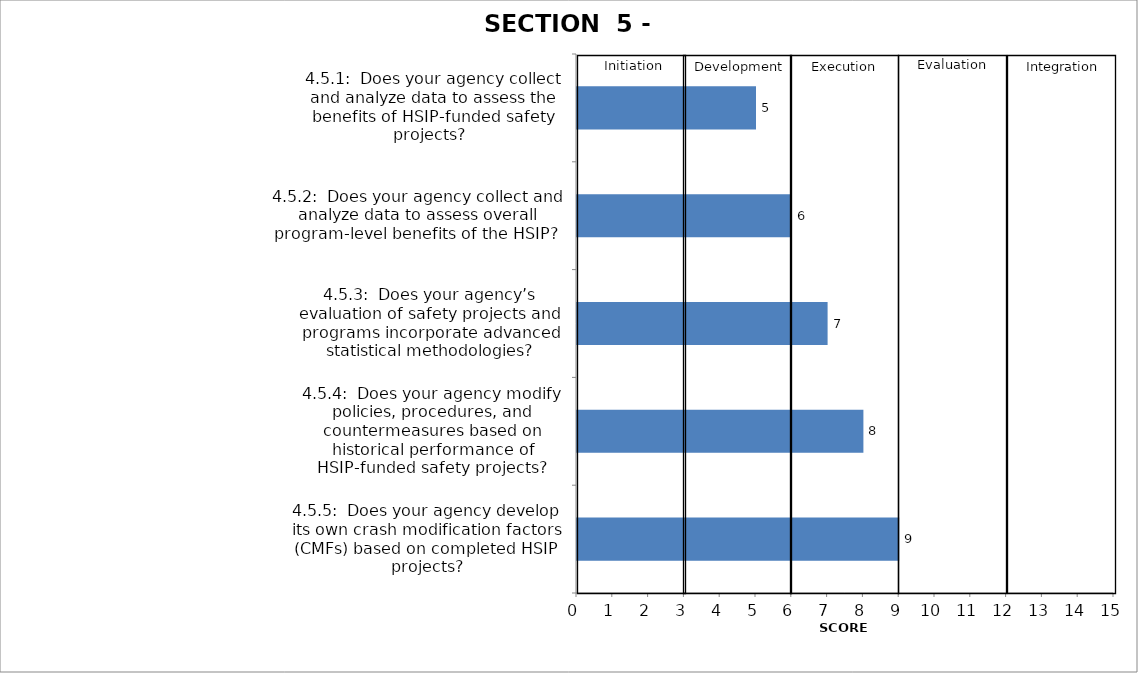
| Category | Series 0 |
|---|---|
| 4.5.1:  Does your agency collect and analyze data to assess the benefits of HSIP-funded safety projects?   | 5 |
| 4.5.2:  Does your agency collect and analyze data to assess overall program-level benefits of the HSIP?  | 6 |
| 4.5.3:  Does your agency’s evaluation of safety projects and programs incorporate advanced statistical methodologies? | 7 |
| 4.5.4:  Does your agency modify policies, procedures, and countermeasures based on historical performance of HSIP-funded safety projects? | 8 |
| 4.5.5:  Does your agency develop its own crash modification factors (CMFs) based on completed HSIP projects? | 9 |